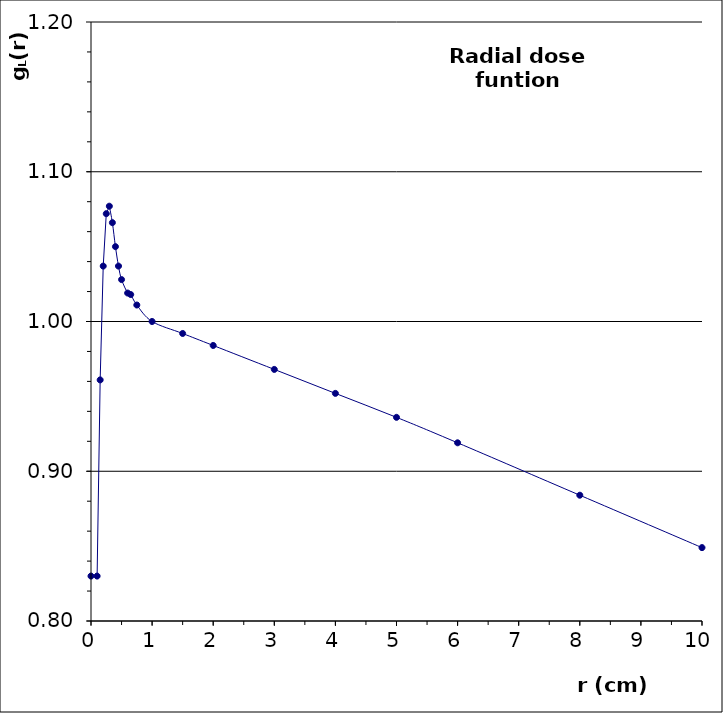
| Category | gL( r) |
|---|---|
| 0.0 | 0.83 |
| 0.1 | 0.83 |
| 0.15 | 0.961 |
| 0.2 | 1.037 |
| 0.25 | 1.072 |
| 0.3 | 1.077 |
| 0.35 | 1.066 |
| 0.4 | 1.05 |
| 0.45 | 1.037 |
| 0.5 | 1.028 |
| 0.6 | 1.019 |
| 0.65 | 1.018 |
| 0.75 | 1.011 |
| 1.0 | 1 |
| 1.5 | 0.992 |
| 2.0 | 0.984 |
| 3.0 | 0.968 |
| 4.0 | 0.952 |
| 5.0 | 0.936 |
| 6.0 | 0.919 |
| 8.0 | 0.884 |
| 10.0 | 0.849 |